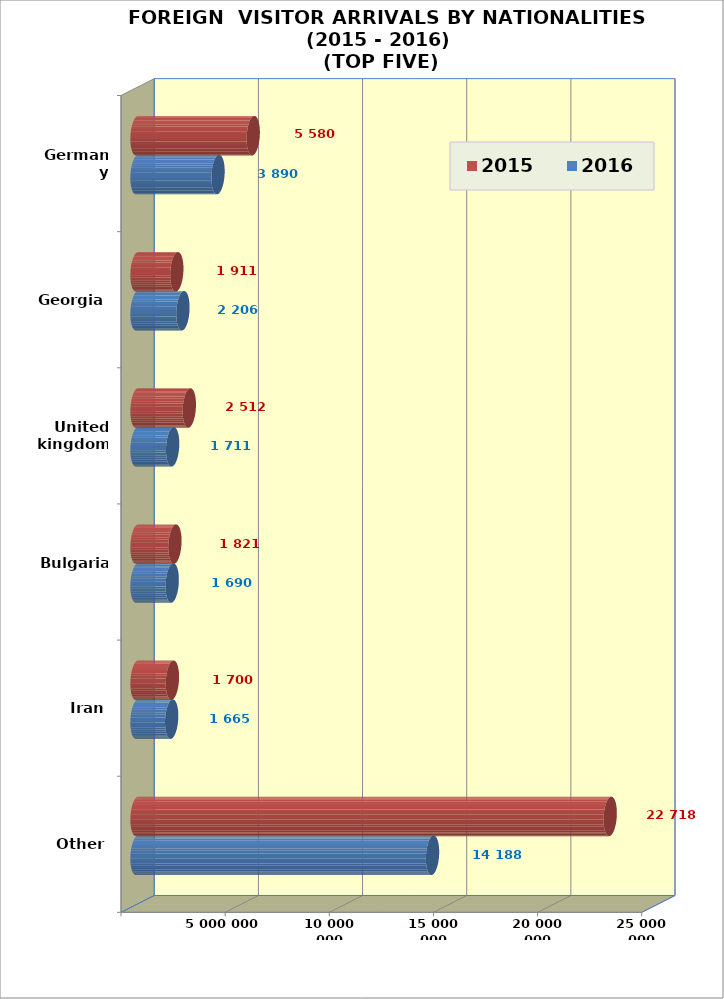
| Category | 2016 | 2015 |
|---|---|---|
| Other | 14188466 | 22718004 |
| Iran | 1665160 | 1700385 |
| Bulgaria | 1690766 | 1821480 |
| United kingdom | 1711481 | 2512139 |
| Georgia | 2206266 | 1911832 |
| Germany | 3890074 | 5580792 |